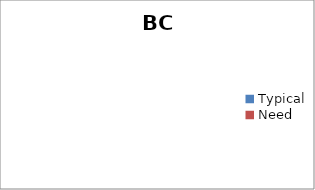
| Category | Series 0 |
|---|---|
| Typical | 0 |
| Need | 0 |